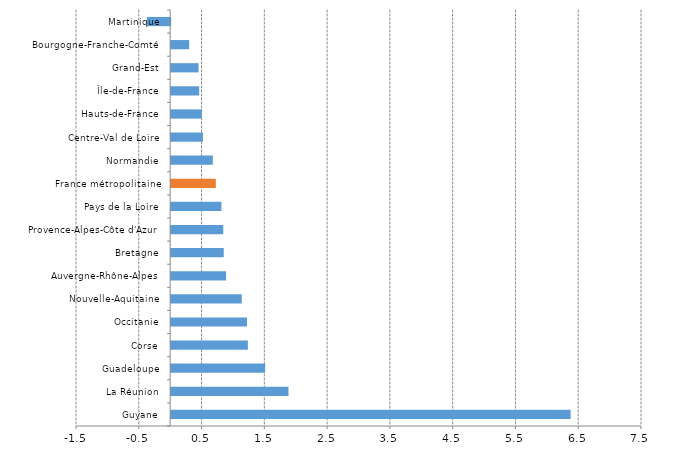
| Category | Series 0 |
|---|---|
| Guyane | 6.363 |
| La Réunion | 1.869 |
| Guadeloupe | 1.497 |
| Corse | 1.222 |
| Occitanie | 1.208 |
| Nouvelle-Aquitaine | 1.125 |
| Auvergne-Rhône-Alpes | 0.874 |
| Bretagne | 0.838 |
| Provence-Alpes-Côte d'Azur | 0.829 |
| Pays de la Loire | 0.801 |
| France métropolitaine | 0.711 |
| Normandie | 0.664 |
| Centre-Val de Loire | 0.506 |
| Hauts-de-France | 0.487 |
| Île-de-France | 0.447 |
| Grand-Est | 0.436 |
| Bourgogne-Franche-Comté | 0.287 |
| Martinique | -0.37 |